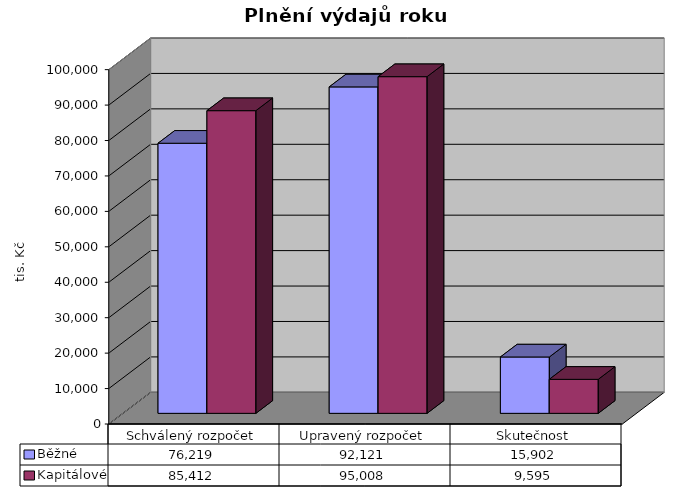
| Category | Běžné | Kapitálové |
|---|---|---|
| Schválený rozpočet | 76219 | 85412 |
| Upravený rozpočet | 92121 | 95008 |
| Skutečnost | 15902 | 9595 |